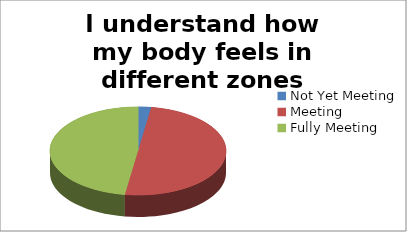
| Category | I understand how my body feels in different zones |
|---|---|
| Not Yet Meeting | 2 |
| Meeting | 42 |
| Fully Meeting | 40 |